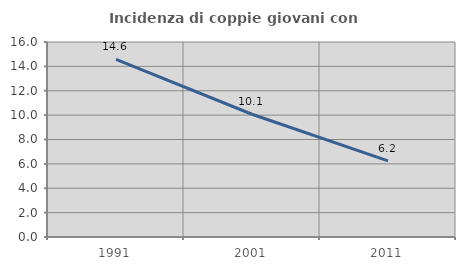
| Category | Incidenza di coppie giovani con figli |
|---|---|
| 1991.0 | 14.578 |
| 2001.0 | 10.071 |
| 2011.0 | 6.245 |